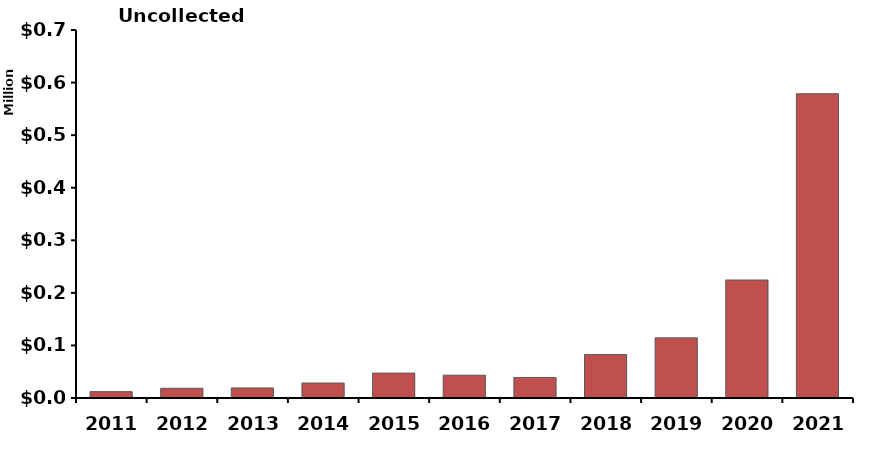
| Category | Uncollected Taxes |
|---|---|
| 2011.0 | 12119 |
| 2012.0 | 18447 |
| 2013.0 | 19160 |
| 2014.0 | 28482 |
| 2015.0 | 47375 |
| 2016.0 | 43356 |
| 2017.0 | 39063 |
| 2018.0 | 82675 |
| 2019.0 | 114385 |
| 2020.0 | 224467 |
| 2021.0 | 578764 |